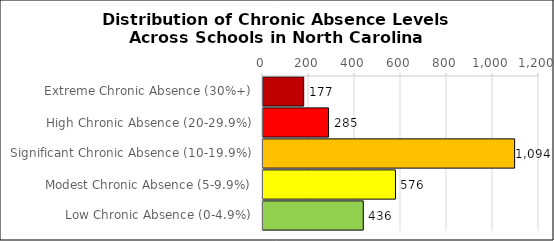
| Category | Number of Schools |
|---|---|
| Extreme Chronic Absence (30%+) | 177 |
| High Chronic Absence (20-29.9%) | 285 |
| Significant Chronic Absence (10-19.9%) | 1094 |
| Modest Chronic Absence (5-9.9%) | 576 |
| Low Chronic Absence (0-4.9%) | 436 |